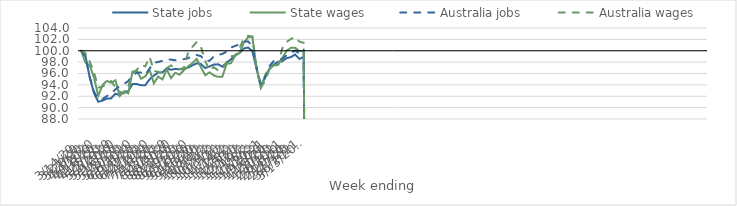
| Category | State jobs | State wages | Australia jobs | Australia wages |
|---|---|---|---|---|
| 14/03/2020 | 100 | 100 | 100 | 100 |
| 21/03/2020 | 99.128 | 97.917 | 98.956 | 99.571 |
| 28/03/2020 | 95.343 | 97.459 | 95.411 | 98.095 |
| 04/04/2020 | 92.561 | 95.299 | 92.814 | 96.217 |
| 11/04/2020 | 91.032 | 92.085 | 91.522 | 93.51 |
| 18/04/2020 | 91.239 | 93.964 | 91.499 | 93.706 |
| 25/04/2020 | 91.578 | 94.717 | 92.024 | 94.115 |
| 02/05/2020 | 91.629 | 94.358 | 92.518 | 94.669 |
| 09/05/2020 | 92.447 | 94.794 | 93.198 | 93.587 |
| 16/05/2020 | 92.2 | 92.038 | 93.789 | 92.821 |
| 23/05/2020 | 92.811 | 92.83 | 94.145 | 92.476 |
| 30/05/2020 | 92.857 | 92.504 | 94.654 | 93.783 |
| 06/06/2020 | 94.166 | 96.328 | 95.642 | 95.969 |
| 13/06/2020 | 94.143 | 96.481 | 96.146 | 96.63 |
| 20/06/2020 | 93.938 | 95.09 | 96.166 | 97.54 |
| 27/06/2020 | 93.949 | 95.496 | 95.757 | 97.254 |
| 04/07/2020 | 94.975 | 96.656 | 96.891 | 98.931 |
| 11/07/2020 | 95.632 | 94.262 | 97.918 | 96.452 |
| 18/07/2020 | 96.163 | 95.476 | 98.015 | 96.287 |
| 25/07/2020 | 96.198 | 94.958 | 98.234 | 96.104 |
| 01/08/2020 | 96.889 | 96.72 | 98.45 | 96.943 |
| 08/08/2020 | 96.656 | 95.195 | 98.442 | 97.412 |
| 15/08/2020 | 96.808 | 96.118 | 98.335 | 96.914 |
| 22/08/2020 | 96.734 | 95.795 | 98.39 | 96.757 |
| 29/08/2020 | 96.836 | 96.572 | 98.521 | 96.978 |
| 05/09/2020 | 97.028 | 97.246 | 98.687 | 99.677 |
| 12/09/2020 | 97.432 | 97.814 | 99.091 | 100.68 |
| 19/09/2020 | 97.794 | 98.562 | 99.254 | 101.536 |
| 26/09/2020 | 97.657 | 97.106 | 99.049 | 100.689 |
| 03/10/2020 | 96.958 | 95.69 | 98.196 | 98.175 |
| 10/10/2020 | 97.237 | 96.21 | 98.237 | 96.534 |
| 17/10/2020 | 97.566 | 95.667 | 98.99 | 97.113 |
| 24/10/2020 | 97.616 | 95.412 | 99.254 | 96.552 |
| 31/10/2020 | 97.199 | 95.422 | 99.461 | 96.668 |
| 07/11/2020 | 97.902 | 97.716 | 99.844 | 98.053 |
| 14/11/2020 | 98.47 | 97.802 | 100.553 | 99.053 |
| 21/11/2020 | 99.216 | 99.129 | 100.846 | 99.075 |
| 28/11/2020 | 99.595 | 99.612 | 101.126 | 100.407 |
| 05/12/2020 | 100.395 | 101.382 | 101.622 | 102.179 |
| 12/12/2020 | 100.562 | 102.354 | 101.647 | 102.628 |
| 19/12/2020 | 99.971 | 102.486 | 100.808 | 102.478 |
| 26/12/2020 | 96.885 | 96.942 | 96.977 | 96.957 |
| 02/01/2021 | 93.737 | 93.542 | 94.05 | 93.527 |
| 09/01/2021 | 95.354 | 95.699 | 95.274 | 94.722 |
| 16/01/2021 | 96.82 | 96.745 | 97.292 | 96.737 |
| 23/01/2021 | 97.548 | 97.453 | 98.18 | 97.336 |
| 30/01/2021 | 98.048 | 97.513 | 98.522 | 97.507 |
| 06/02/2021 | 98.151 | 98.676 | 98.581 | 100.419 |
| 13/02/2021 | 98.689 | 99.996 | 99.185 | 101.54 |
| 20/02/2021 | 98.872 | 100.509 | 99.643 | 102.046 |
| 27/02/2021 | 99.346 | 100.546 | 100.036 | 102.451 |
| 06/03/2021 | 98.559 | 99.948 | 99.503 | 101.603 |
| 13/03/2021 | 98.902 | 99.939 | 100.244 | 101.4 |